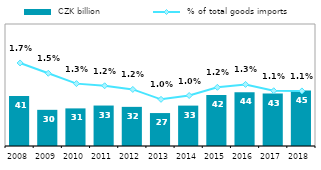
| Category |  CZK billion |
|---|---|
| 2008.0 | 40.944 |
| 2009.0 | 29.644 |
| 2010.0 | 30.825 |
| 2011.0 | 33.166 |
| 2012.0 | 32.078 |
| 2013.0 | 27.003 |
| 2014.0 | 33.108 |
| 2015.0 | 41.813 |
| 2016.0 | 44.109 |
| 2017.0 | 43.031 |
| 2018.0 | 45.4 |